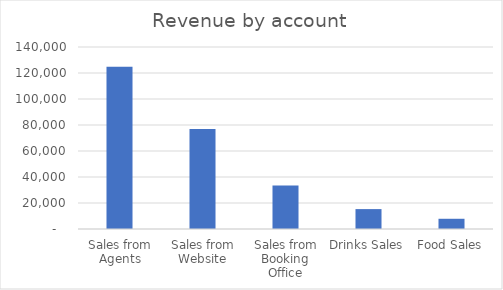
| Category | Total |
|---|---|
| Sales from Agents | 124766.69 |
| Sales from Website | 76881.53 |
| Sales from Booking Office | 33404.87 |
| Drinks Sales | 15308.34 |
| Food Sales | 7865 |